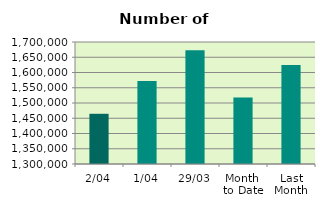
| Category | Series 0 |
|---|---|
| 2/04 | 1464610 |
| 1/04 | 1572004 |
| 29/03 | 1672816 |
| Month 
to Date | 1518307 |
| Last
Month | 1624932.286 |